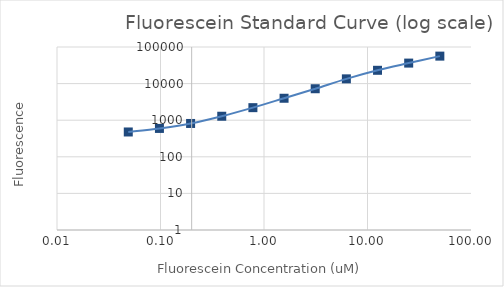
| Category | Series 1 |
|---|---|
| 50.0 | 56341.75 |
| 25.0 | 36326 |
| 12.5 | 23094 |
| 6.25 | 13482 |
| 3.125 | 7237.25 |
| 1.5625 | 3977 |
| 0.78125 | 2201.25 |
| 0.390625 | 1282.75 |
| 0.1953125 | 814.5 |
| 0.09765625 | 596 |
| 0.048828125 | 476.75 |